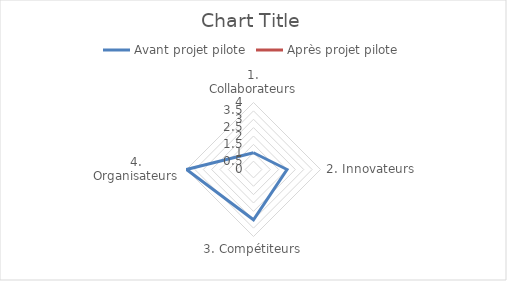
| Category | Avant projet pilote | Après projet pilote |
|---|---|---|
| 1. Collaborateurs | 1 |  |
| 2. Innovateurs | 2 |  |
| 3. Compétiteurs | 3 |  |
| 4. Organisateurs | 4 |  |